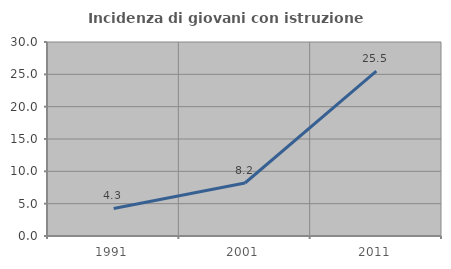
| Category | Incidenza di giovani con istruzione universitaria |
|---|---|
| 1991.0 | 4.255 |
| 2001.0 | 8.197 |
| 2011.0 | 25.49 |